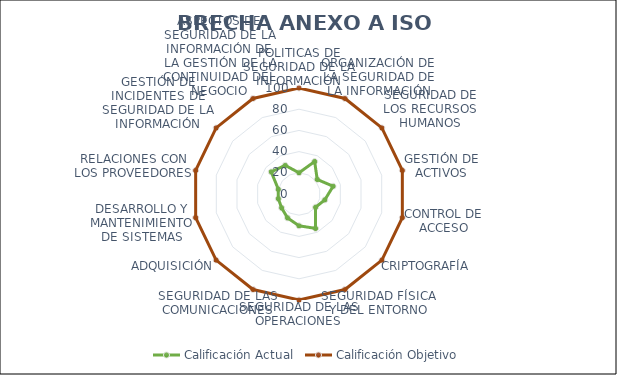
| Category | Calificación Actual | Calificación Objetivo |
|---|---|---|
| 0 | 20 | 100 |
| 1 | 34 | 100 |
| 2 | 22 | 100 |
| 3 | 33 | 100 |
| 4 | 25 | 100 |
| 5 | 20 | 100 |
| 6 | 36 | 100 |
| 7 | 30 | 100 |
| 8 | 25 | 100 |
| 9 | 21 | 100 |
| 10 | 20 | 100 |
| 11 | 20 | 100 |
| 12 | 33.5 | 100 |
| 13 | 30 | 100 |